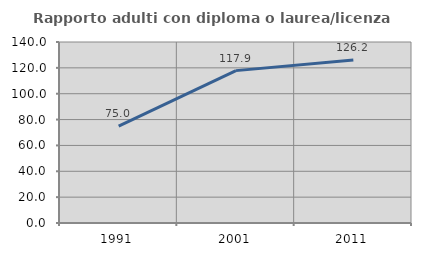
| Category | Rapporto adulti con diploma o laurea/licenza media  |
|---|---|
| 1991.0 | 75 |
| 2001.0 | 117.857 |
| 2011.0 | 126.154 |